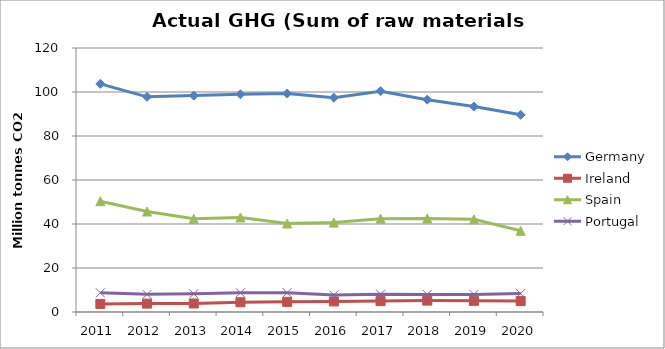
| Category | Germany | Ireland | Spain | Portugal |
|---|---|---|---|---|
| 2011 | 103706929.97 | 3674642.33 | 50367028.12 | 8718611.9 |
| 2012 | 97799695.63 | 3816457.82 | 45674850.29 | 8023987 |
| 2013 | 98358762.21 | 3873969.41 | 42368475.19 | 8267359.9 |
| 2014 | 98958866.39 | 4424948.44 | 42958738.04 | 8740648.3 |
| 2015 | 99305447 | 4618689.91 | 40217316.51 | 8754802.5 |
| 2016 | 97385675.85 | 4797383.74 | 40640885.77 | 7677053.7 |
| 2017 | 100370008.39 | 4949893.56 | 42426674.85 | 8108071 |
| 2018 | 96502340.5 | 5181257.38 | 42515773.23 | 7973031.7 |
| 2019 | 93368374.4 | 5082559.32 | 42123403.23 | 8004869 |
| 2020 | 89618485.98 | 4969163.84 | 36905960.5 | 8388356.59 |